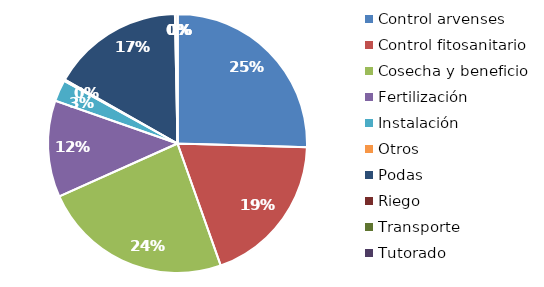
| Category | Valor |
|---|---|
| Control arvenses | 21555000 |
| Control fitosanitario | 16200000 |
| Cosecha y beneficio | 20088000 |
| Fertilización | 10215000 |
| Instalación | 2275000 |
| Otros | 135000 |
| Podas | 13950000 |
| Riego | 270000 |
| Transporte | 0 |
| Tutorado | 0 |